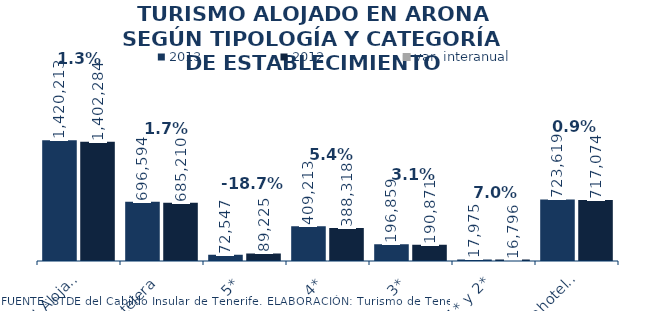
| Category | 2013 | 2012 |
|---|---|---|
| Total Alojados | 1420213 | 1402284 |
| Hotelera | 696594 | 685210 |
| 5* | 72547 | 89225 |
| 4* | 409213 | 388318 |
| 3* | 196859 | 190871 |
| 1* y 2* | 17975 | 16796 |
| Extrahotelera | 723619 | 717074 |